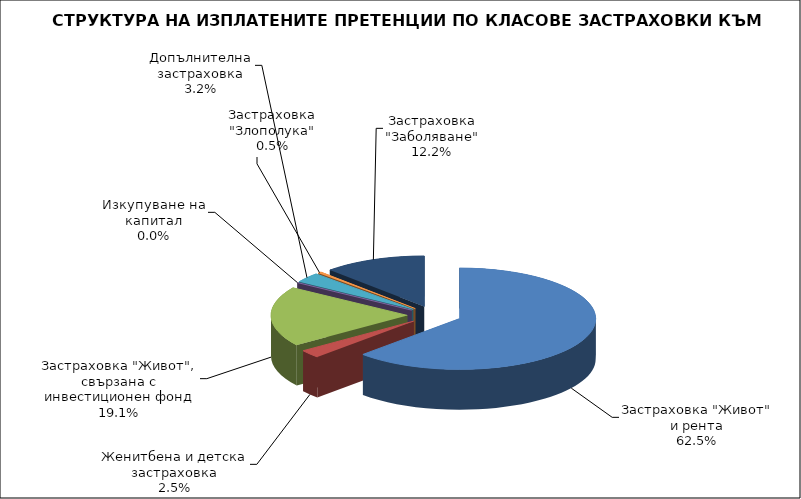
| Category | 24 121 238 |
|---|---|
| Застраховка "Живот" и рента | 24121237.83 |
| Женитбена и детска застраховка | 979720.985 |
| Застраховка "Живот", свързана с инвестиционен фонд | 7377747.59 |
| Изкупуване на капитал | 0 |
| Допълнителна застраховка | 1234059.931 |
| Застраховка "Злополука" | 174288.222 |
| Застраховка "Заболяване" | 4699253.973 |